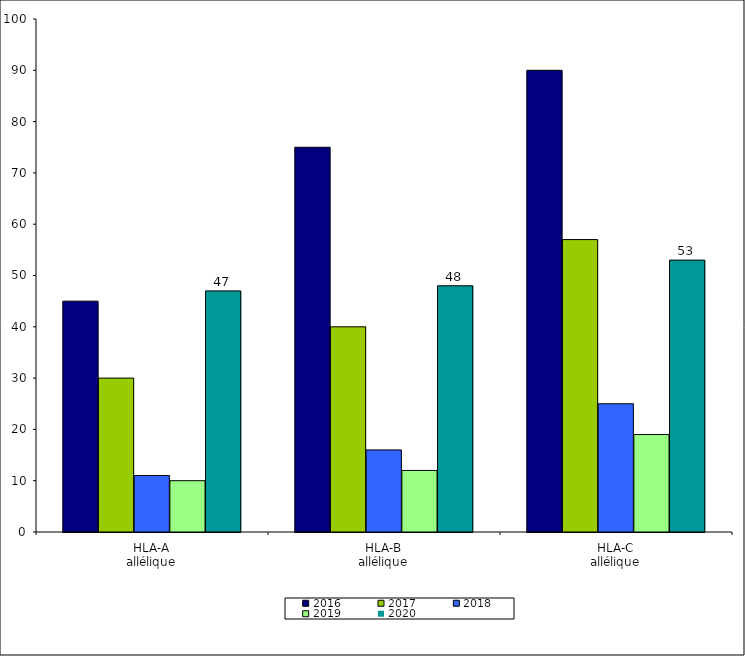
| Category | 2016 | 2017 | 2018 | 2019 | 2020 |
|---|---|---|---|---|---|
| HLA-A
allélique | 45 | 30 | 11 | 10 | 47 |
| HLA-B
allélique | 75 | 40 | 16 | 12 | 48 |
| HLA-C
allélique | 90 | 57 | 25 | 19 | 53 |